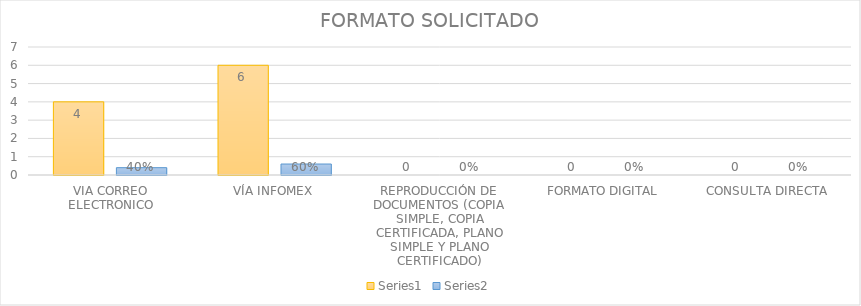
| Category | Series 3 | Series 4 |
|---|---|---|
| VIA CORREO ELECTRONICO | 4 | 0.4 |
| VÍA INFOMEX | 6 | 0.6 |
| REPRODUCCIÓN DE DOCUMENTOS (COPIA SIMPLE, COPIA CERTIFICADA, PLANO SIMPLE Y PLANO CERTIFICADO) | 0 | 0 |
| FORMATO DIGITAL | 0 | 0 |
| CONSULTA DIRECTA | 0 | 0 |